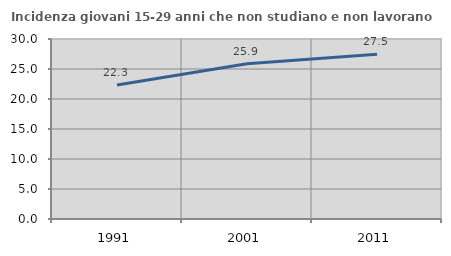
| Category | Incidenza giovani 15-29 anni che non studiano e non lavorano  |
|---|---|
| 1991.0 | 22.346 |
| 2001.0 | 25.862 |
| 2011.0 | 27.457 |